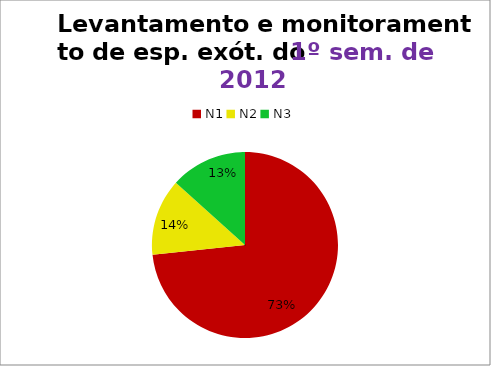
| Category | 1º/12 |
|---|---|
| N1 | 22 |
| N2 | 4 |
| N3 | 4 |